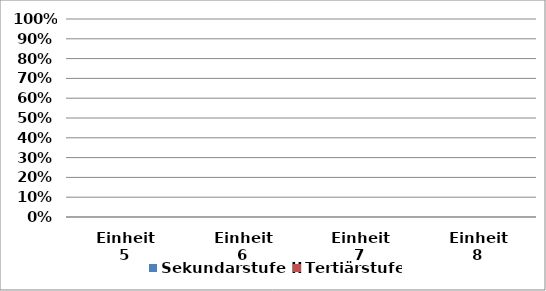
| Category | Sekundarstufe II | Tertiärstufe |
|---|---|---|
| Einheit 5 | 0 | 0 |
| Einheit 6 | 0 | 0 |
| Einheit 7 | 0 | 0 |
| Einheit 8 | 0 | 0 |